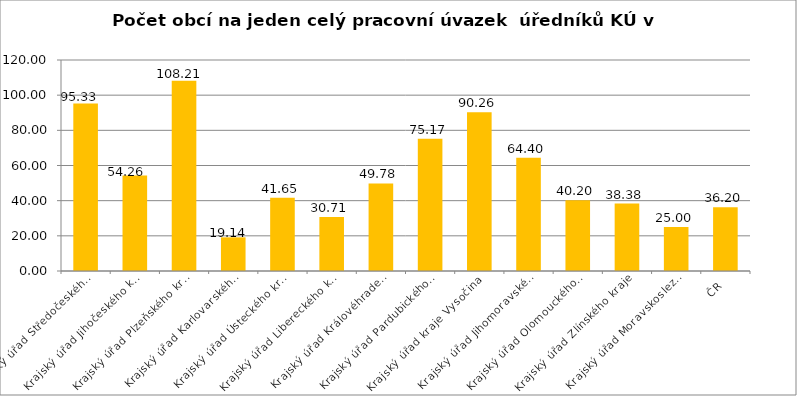
| Category | Počet obcí na jeden celý pracovní úvazek  úředníků KÚ |
|---|---|
| Krajský úřad Středočeského kraje | 95.33 |
| Krajský úřad Jihočeského kraje | 54.26 |
| Krajský úřad Plzeňského kraje | 108.21 |
| Krajský úřad Karlovarského kraje | 19.14 |
| Krajský úřad Ústeckého kraje | 41.65 |
| Krajský úřad Libereckého kraje | 30.71 |
| Krajský úřad Královéhradeckého kraje | 49.78 |
| Krajský úřad Pardubického kraje | 75.17 |
| Krajský úřad kraje Vysočina | 90.26 |
| Krajský úřad Jihomoravského kraje | 64.4 |
| Krajský úřad Olomouckého kraje | 40.2 |
| Krajský úřad Zlínského kraje | 38.38 |
| Krajský úřad Moravskoslezského kraje | 25 |
| ČR | 36.2 |